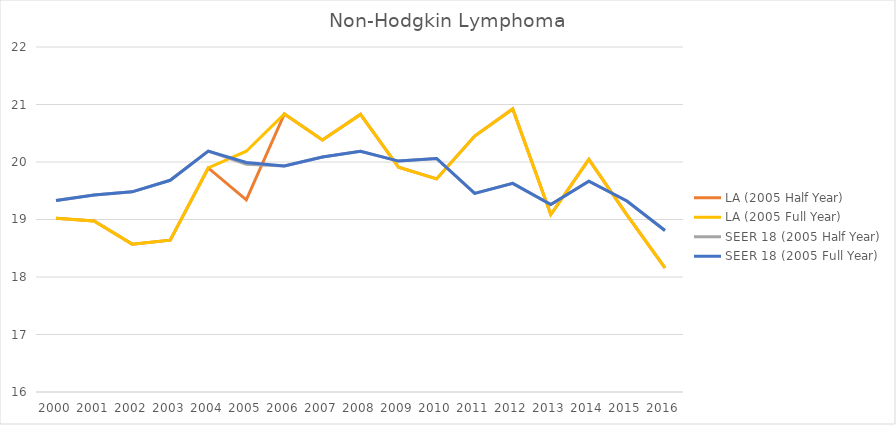
| Category | LA (2005 Half Year) | LA (2005 Full Year) | SEER 18 (2005 Half Year) | SEER 18 (2005 Full Year) |
|---|---|---|---|---|
| 2000.0 | 19.024 | 19.024 | 19.332 | 19.332 |
| 2001.0 | 18.974 | 18.974 | 19.427 | 19.427 |
| 2002.0 | 18.572 | 18.572 | 19.481 | 19.481 |
| 2003.0 | 18.641 | 18.641 | 19.682 | 19.682 |
| 2004.0 | 19.896 | 19.896 | 20.19 | 20.19 |
| 2005.0 | 19.343 | 20.188 | 19.959 | 19.99 |
| 2006.0 | 20.836 | 20.836 | 19.932 | 19.932 |
| 2007.0 | 20.383 | 20.383 | 20.085 | 20.085 |
| 2008.0 | 20.828 | 20.828 | 20.187 | 20.187 |
| 2009.0 | 19.908 | 19.908 | 20.016 | 20.016 |
| 2010.0 | 19.706 | 19.706 | 20.061 | 20.061 |
| 2011.0 | 20.451 | 20.451 | 19.454 | 19.454 |
| 2012.0 | 20.922 | 20.922 | 19.629 | 19.629 |
| 2013.0 | 19.086 | 19.086 | 19.26 | 19.26 |
| 2014.0 | 20.045 | 20.045 | 19.665 | 19.665 |
| 2015.0 | 19.08 | 19.08 | 19.322 | 19.322 |
| 2016.0 | 18.158 | 18.158 | 18.809 | 18.809 |